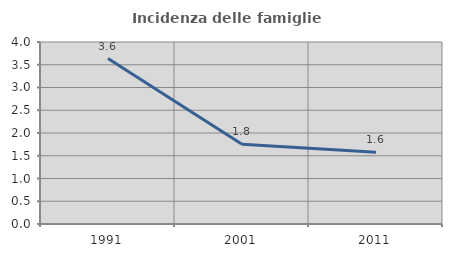
| Category | Incidenza delle famiglie numerose |
|---|---|
| 1991.0 | 3.635 |
| 2001.0 | 1.754 |
| 2011.0 | 1.576 |